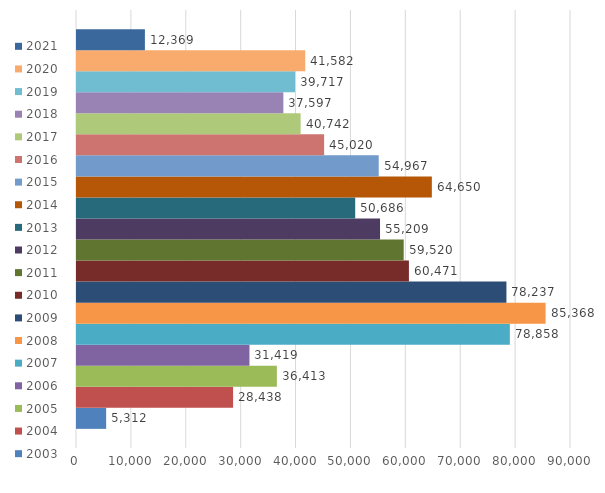
| Category | 2003 | 2004 | 2005 | 2006 | 2007 | 2008 | 2009 | 2010 | 2011 | 2012 | 2013 | 2014 | 2015 | 2016 | 2017 | 2018 | 2019 | 2020 | 2021 |
|---|---|---|---|---|---|---|---|---|---|---|---|---|---|---|---|---|---|---|---|
| 0 | 5312 | 28438 | 36413 | 31419 | 78858 | 85368 | 78237 | 60471 | 59520 | 55209 | 50686 | 64650 | 54967 | 45020 | 40742 | 37597 | 39717 | 41582 | 12369 |